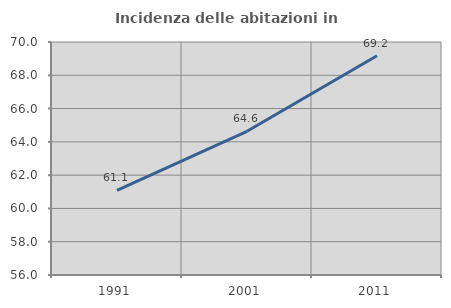
| Category | Incidenza delle abitazioni in proprietà  |
|---|---|
| 1991.0 | 61.084 |
| 2001.0 | 64.633 |
| 2011.0 | 69.176 |